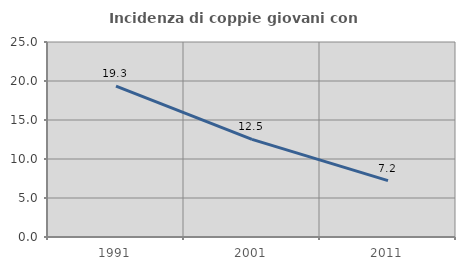
| Category | Incidenza di coppie giovani con figli |
|---|---|
| 1991.0 | 19.33 |
| 2001.0 | 12.52 |
| 2011.0 | 7.236 |